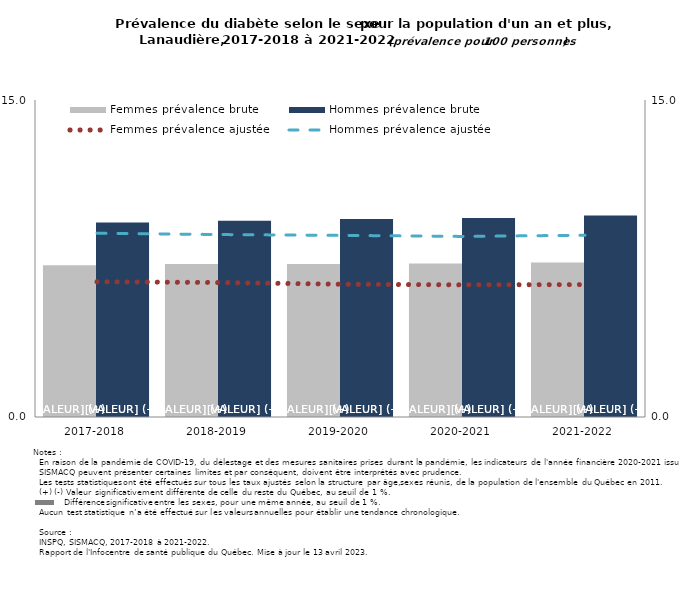
| Category | Femmes prévalence brute | Hommes prévalence brute |
|---|---|---|
| 2017-2018 | 7.178 | 9.203 |
| 2018-2019 | 7.243 | 9.289 |
| 2019-2020 | 7.235 | 9.363 |
| 2020-2021 | 7.264 | 9.421 |
| 2021-2022 | 7.312 | 9.539 |